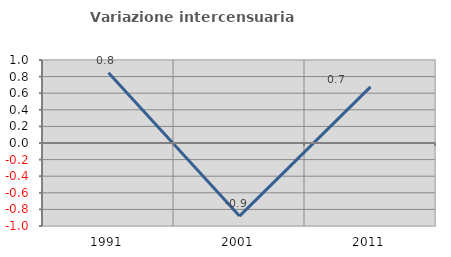
| Category | Variazione intercensuaria annua |
|---|---|
| 1991.0 | 0.846 |
| 2001.0 | -0.88 |
| 2011.0 | 0.677 |